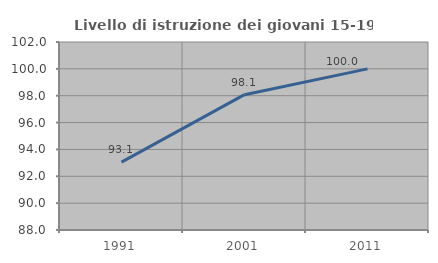
| Category | Livello di istruzione dei giovani 15-19 anni |
|---|---|
| 1991.0 | 93.056 |
| 2001.0 | 98.077 |
| 2011.0 | 100 |